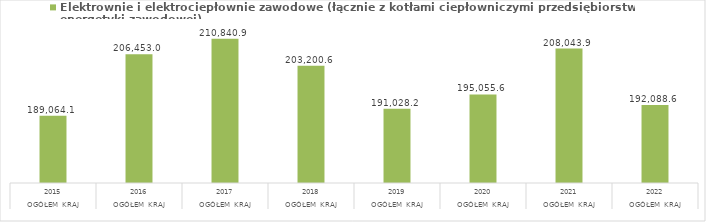
| Category | Elektrownie i elektrociepłownie zawodowe (łącznie z kotłami ciepłowniczymi przedsiębiorstw energetyki zawodowej) |
|---|---|
| 0 | 189064.1 |
| 1 | 206453 |
| 2 | 210840.9 |
| 3 | 203200.6 |
| 4 | 191028.2 |
| 5 | 195055.6 |
| 6 | 208043.9 |
| 7 | 192088.6 |